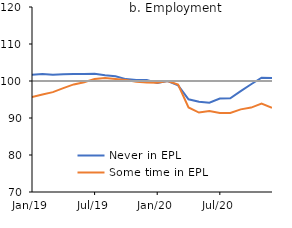
| Category | Never in EPL | Some time in EPL | Series 2 |
|---|---|---|---|
| 2019-01-01 | 101.667 | 95.644 | 100 |
| 2019-02-01 | 101.892 | 96.359 | 100 |
| 2019-03-01 | 101.666 | 96.984 | 100 |
| 2019-04-01 | 101.805 | 98.068 | 100 |
| 2019-05-01 | 101.874 | 99.073 | 100 |
| 2019-06-01 | 101.868 | 99.67 | 100 |
| 2019-07-01 | 101.964 | 100.568 | 100 |
| 2019-08-01 | 101.537 | 100.788 | 100 |
| 2019-09-01 | 101.284 | 100.563 | 100 |
| 2019-10-01 | 100.514 | 100.241 | 100 |
| 2019-11-01 | 100.283 | 99.777 | 100 |
| 2019-12-01 | 100.246 | 99.586 | 100 |
| 2020-01-01 | 99.471 | 99.502 | 100 |
| 2020-02-01 | 100 | 100 | 100 |
| 2020-03-01 | 98.837 | 99.054 | 100 |
| 2020-04-01 | 95.046 | 92.848 | 100 |
| 2020-05-01 | 94.373 | 91.474 | 100 |
| 2020-06-01 | 94.118 | 91.91 | 100 |
| 2020-07-01 | 95.263 | 91.37 | 100 |
| 2020-08-01 | 95.344 | 91.378 | 100 |
| 2020-09-01 | 97.281 | 92.336 | 100 |
| 2020-10-01 | 99.128 | 92.819 | 100 |
| 2020-11-01 | 100.872 | 93.873 | 100 |
| 2020-12-01 | 100.839 | 92.748 | 100 |